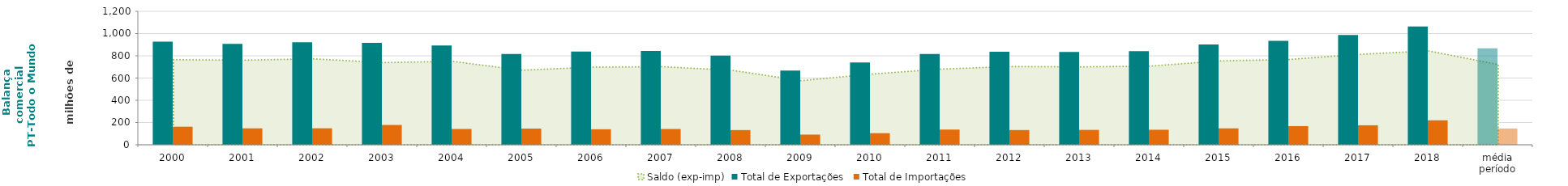
| Category | Total de Exportações  | Total de Importações  |
|---|---|---|
| 2000 | 927.507 | 162.341 |
| 2001 | 908.085 | 147.587 |
| 2002 | 921.18 | 148.139 |
| 2003 | 916.814 | 178.058 |
| 2004 | 891.902 | 142.096 |
| 2005 | 815.757 | 145.443 |
| 2006 | 837.33 | 139.346 |
| 2007 | 844.064 | 141.949 |
| 2008 | 802.517 | 132.066 |
| 2009 | 667.69 | 91.371 |
| 2010 | 739.381 | 104.282 |
| 2011 | 817.035 | 136.688 |
| 2012 | 835.816 | 132.304 |
| 2013 | 833.695 | 133.688 |
| 2014 | 841.785 | 135.004 |
| 2015 | 901.525 | 147.483 |
| 2016 | 934.836 | 167.809 |
| 2017 | 988.036 | 175.229 |
| 2018 | 1063.777 | 219.898 |
| média período | 867.828 | 146.357 |